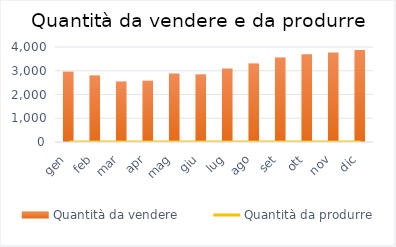
| Category | Quantità da vendere |
|---|---|
| gen | 2960 |
| feb | 2800 |
| mar | 2550 |
| apr | 2580 |
| mag | 2880 |
| giu | 2850 |
| lug | 3090 |
| ago | 3310 |
| set | 3560 |
| ott | 3690 |
| nov | 3770 |
| dic | 3870 |